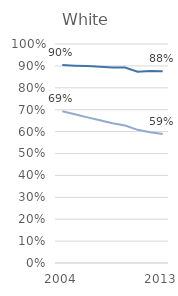
| Category | White Staff | White Student |
|---|---|---|
| 2004 | 90.4 | 69.3 |
|  | 90.1 | 67.9 |
|  | 89.9 | 66.5 |
|  | 89.6 | 65.2 |
|  | 89.3 | 63.8 |
|  | 89.3 | 62.8 |
|  | 87.3 | 60.8 |
|  | 87.7 | 59.7 |
| 2013 | 87.6 | 58.9 |